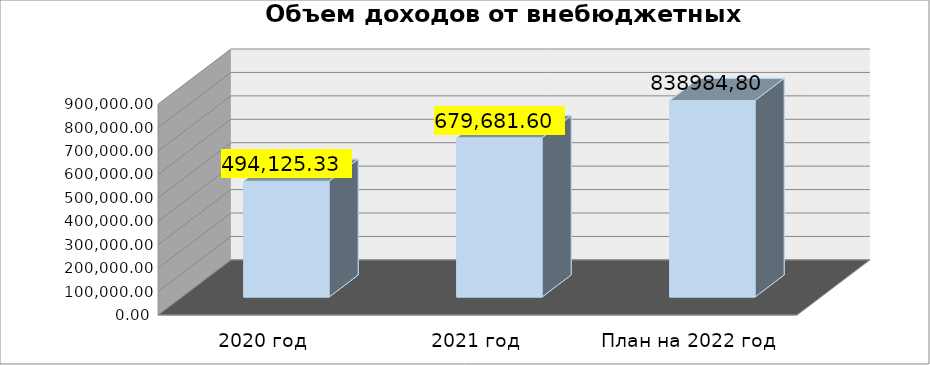
| Category | Series 0 |
|---|---|
| 2020 год | 494125.33 |
| 2021 год | 679681.6 |
| План на 2022 год | 838984.8 |